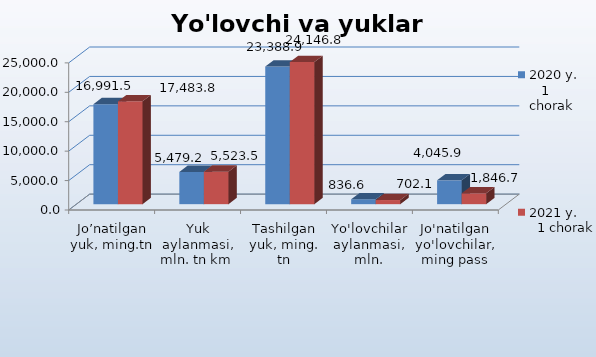
| Category | 2020 y.        1 chorak
 | 2021 y.       1 chorak
 |
|---|---|---|
| Jo’natilgan yuk, ming.tn | 16991.5 | 17483.8 |
| Yuk aylanmasi, mln. tn km  | 5479.2 | 5523.5 |
| Tashilgan yuk, ming. tn | 23388.9 | 24146.8 |
| Yo'lovchilar aylanmasi, mln. pass-km | 836.6 | 702.1 |
| Jo'natilgan yo'lovchilar, ming pass | 4045.9 | 1846.7 |